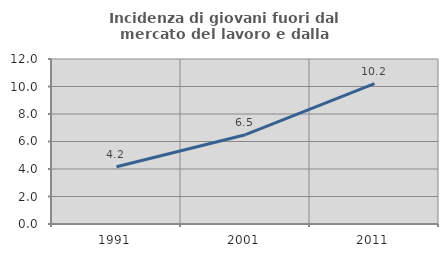
| Category | Incidenza di giovani fuori dal mercato del lavoro e dalla formazione  |
|---|---|
| 1991.0 | 4.167 |
| 2001.0 | 6.494 |
| 2011.0 | 10.204 |